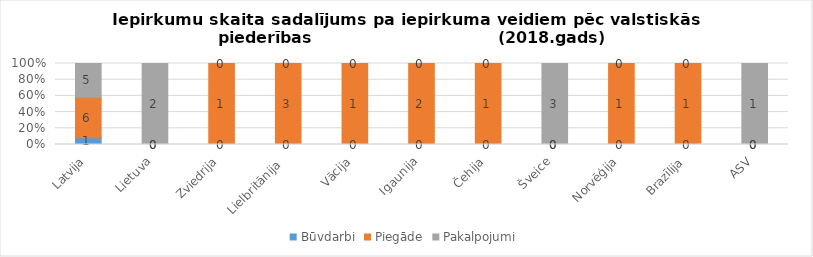
| Category | Būvdarbi | Piegāde | Pakalpojumi |
|---|---|---|---|
| Latvija | 1 | 6 | 5 |
| Lietuva | 0 | 0 | 2 |
| Zviedrija | 0 | 1 | 0 |
| Lielbritānija  | 0 | 3 | 0 |
| Vācija | 0 | 1 | 0 |
| Igaunija | 0 | 2 | 0 |
| Čehija | 0 | 1 | 0 |
| Šveice | 0 | 0 | 3 |
| Norvēģija | 0 | 1 | 0 |
| Brazīlija | 0 | 1 | 0 |
| ASV | 0 | 0 | 1 |